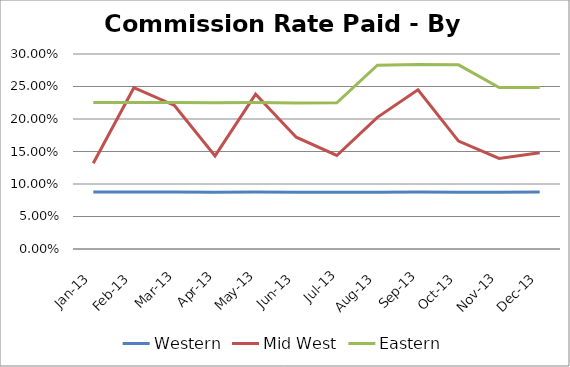
| Category | Western | Mid West | Eastern |
|---|---|---|---|
| 2013-01-31 | 0.088 | 0.132 | 0.225 |
| 2013-02-28 | 0.088 | 0.248 | 0.225 |
| 2013-03-31 | 0.088 | 0.221 | 0.225 |
| 2013-04-30 | 0.087 | 0.143 | 0.225 |
| 2013-05-31 | 0.088 | 0.238 | 0.225 |
| 2013-06-30 | 0.087 | 0.172 | 0.225 |
| 2013-07-31 | 0.087 | 0.144 | 0.225 |
| 2013-08-31 | 0.087 | 0.203 | 0.283 |
| 2013-09-30 | 0.088 | 0.245 | 0.284 |
| 2013-10-31 | 0.087 | 0.166 | 0.283 |
| 2013-11-30 | 0.087 | 0.139 | 0.248 |
| 2013-12-31 | 0.088 | 0.148 | 0.249 |